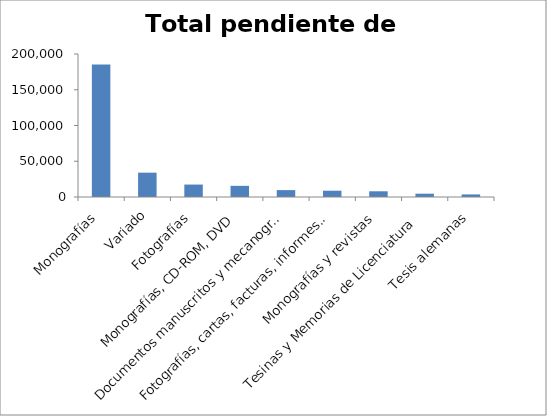
| Category | Total pendiente de catalogación |
|---|---|
| Monografías | 185377 |
| Variado | 34032 |
| Fotografías | 17400 |
| Monografías, CD-ROM, DVD | 15600 |
| Documentos manuscritos y mecanografiados | 9650 |
| Fotografías, cartas, facturas, informes, etc. | 8800 |
| Monografías y revistas | 8000 |
| Tesinas y Memorias de Licenciatura  | 4625 |
| Tesis alemanas | 3600 |